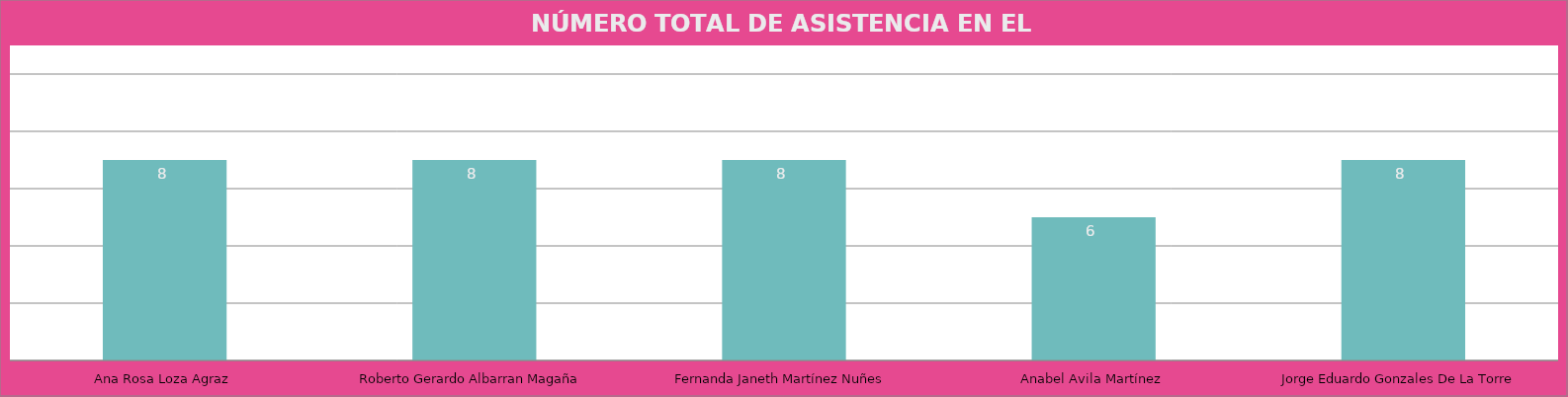
| Category | Ana Rosa Loza Agraz |
|---|---|
| Ana Rosa Loza Agraz | 8 |
| Roberto Gerardo Albarran Magaña | 8 |
| Fernanda Janeth Martínez Nuñes | 8 |
| Anabel Avila Martínez | 6 |
| Jorge Eduardo Gonzales De La Torre | 8 |